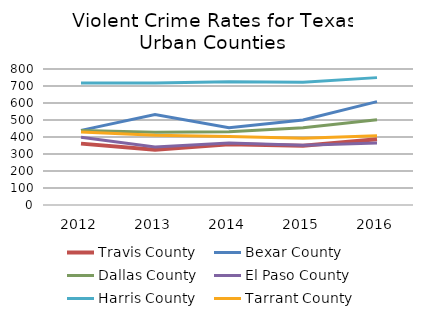
| Category | Travis County | Bexar County | Dallas County | El Paso County | Harris County | Tarrant County |
|---|---|---|---|---|---|---|
| 2012.0 | 361 | 439 | 438 | 399 | 717 | 430 |
| 2013.0 | 325 | 532 | 428 | 341 | 717 | 410 |
| 2014.0 | 357 | 454 | 431.357 | 364 | 725 | 403 |
| 2015.0 | 348 | 500 | 454 | 352 | 722 | 392 |
| 2016.0 | 387.428 | 607.909 | 501.381 | 364.356 | 749.252 | 407.443 |